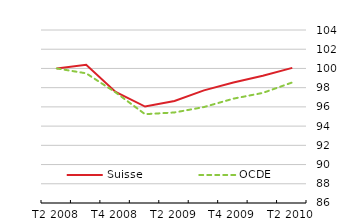
| Category | Suisse | OCDE |
|---|---|---|
| T2 2008 | 100 | 100 |
| T3 2008 | 100.383 | 99.493 |
| T4 2008 | 97.551 | 97.507 |
| T1 2009 | 96.034 | 95.24 |
| T2 2009 | 96.61 | 95.42 |
| T3 2009 | 97.717 | 95.983 |
| T4 2009 | 98.53 | 96.856 |
| T1 2010 | 99.235 | 97.455 |
| T2 2010 | 100.06 | 98.545 |